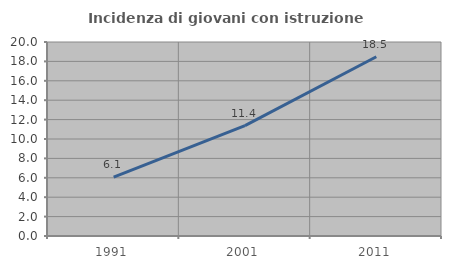
| Category | Incidenza di giovani con istruzione universitaria |
|---|---|
| 1991.0 | 6.061 |
| 2001.0 | 11.374 |
| 2011.0 | 18.483 |